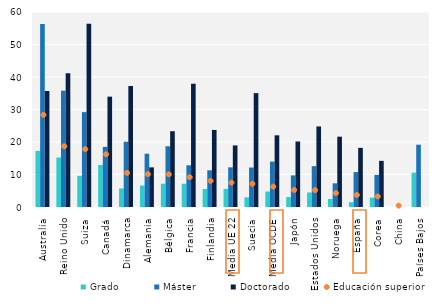
| Category | Grado | Máster | Doctorado |
|---|---|---|---|
| Australia | 17.26 | 56.32 | 35.687 |
| Reino Unido | 15.236 | 35.79 | 41.148 |
| Suiza | 9.591 | 29.196 | 56.359 |
| Canadá | 12.932 | 18.506 | 33.955 |
| Dinamarca | 5.707 | 20.082 | 37.228 |
| Alemania | 6.604 | 16.398 | 12.19 |
| Bélgica | 7.159 | 18.68 | 23.323 |
| Francia | 7.149 | 12.838 | 37.931 |
| Finlandia | 5.529 | 11.293 | 23.712 |
| Media UE 22 | 5.579 | 12.199 | 18.947 |
| Suecia | 2.967 | 12.14 | 35.034 |
| Media OCDE | 4.769 | 13.97 | 22.061 |
| Japón | 3.065 | 9.728 | 20.167 |
| Estados Unidos | 4.482 | 12.569 | 24.784 |
| Noruega | 2.458 | 7.295 | 21.639 |
| España | 1.475 | 10.755 | 18.193 |
| Corea | 2.894 | 9.894 | 14.198 |
| China | 0 | 0 | 0 |
| Países Bajos | 10.553 | 19.165 | 0 |